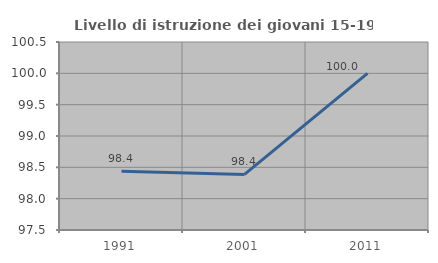
| Category | Livello di istruzione dei giovani 15-19 anni |
|---|---|
| 1991.0 | 98.438 |
| 2001.0 | 98.387 |
| 2011.0 | 100 |